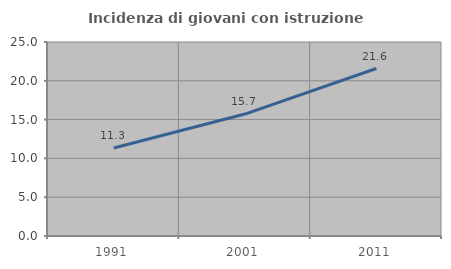
| Category | Incidenza di giovani con istruzione universitaria |
|---|---|
| 1991.0 | 11.342 |
| 2001.0 | 15.714 |
| 2011.0 | 21.58 |